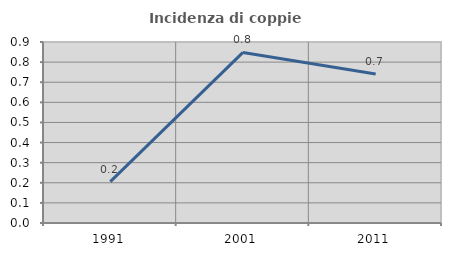
| Category | Incidenza di coppie miste |
|---|---|
| 1991.0 | 0.206 |
| 2001.0 | 0.848 |
| 2011.0 | 0.741 |